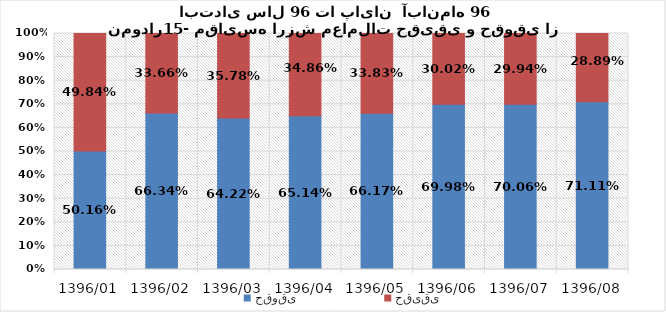
| Category | حقوقی | حقیقی |
|---|---|---|
| 1396/01 | 0.502 | 0.498 |
| 1396/02 | 0.663 | 0.337 |
| 1396/03 | 0.642 | 0.358 |
| 1396/04 | 0.651 | 0.349 |
| 1396/05 | 0.662 | 0.338 |
| 1396/06 | 0.7 | 0.3 |
| 1396/07 | 0.701 | 0.299 |
| 1396/08 | 0.711 | 0.289 |